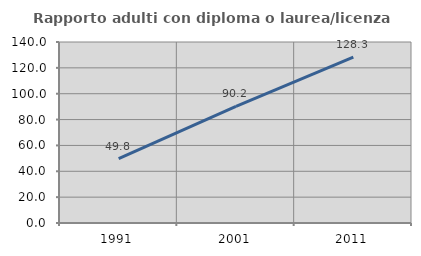
| Category | Rapporto adulti con diploma o laurea/licenza media  |
|---|---|
| 1991.0 | 49.772 |
| 2001.0 | 90.213 |
| 2011.0 | 128.34 |